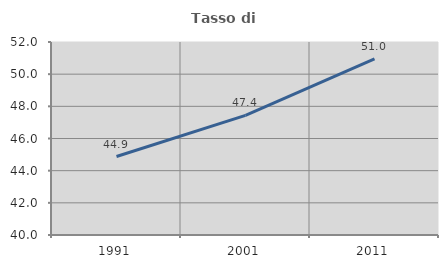
| Category | Tasso di occupazione   |
|---|---|
| 1991.0 | 44.878 |
| 2001.0 | 47.436 |
| 2011.0 | 50.952 |